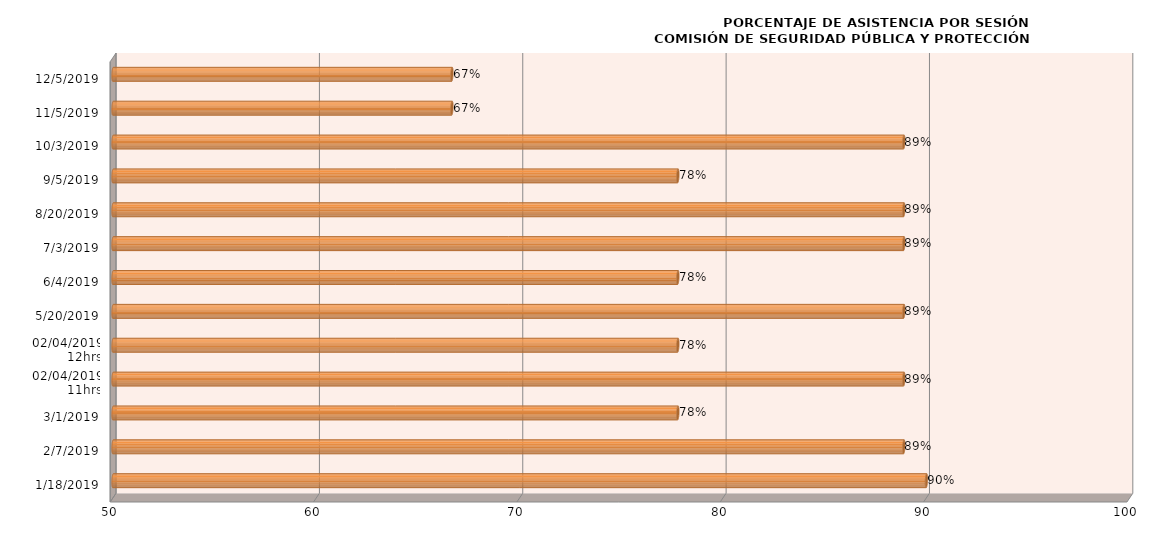
| Category | Series 0 |
|---|---|
| 18/01/2019 | 90 |
| 07/02/2019 | 88.889 |
| 01/03/2019 | 77.778 |
| 02/04/2019
11hrs | 88.889 |
| 02/04/2019
12hrs | 77.778 |
| 20/05/2019 | 88.889 |
| 04/06/2019 | 77.778 |
| 03/07/2019 | 88.889 |
| 20/08/2019 | 88.889 |
| 05/09/2019 | 77.778 |
| 03/10/2019 | 88.889 |
| 05/11/2019 | 66.667 |
| 05/12/2019 | 66.667 |